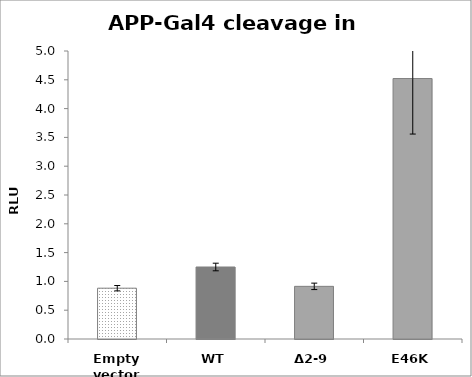
| Category | Series 0 |
|---|---|
| Empty vector | 0.882 |
| WT | 1.25 |
| Δ2-9 | 0.914 |
| E46K | 4.522 |